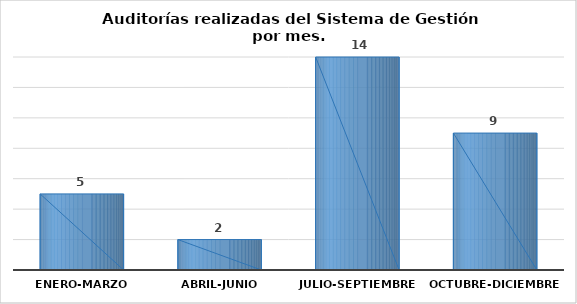
| Category | Series 0 |
|---|---|
| Enero-Marzo | 5 |
| Abril-Junio | 2 |
| Julio-Septiembre | 14 |
| Octubre-Diciembre | 9 |